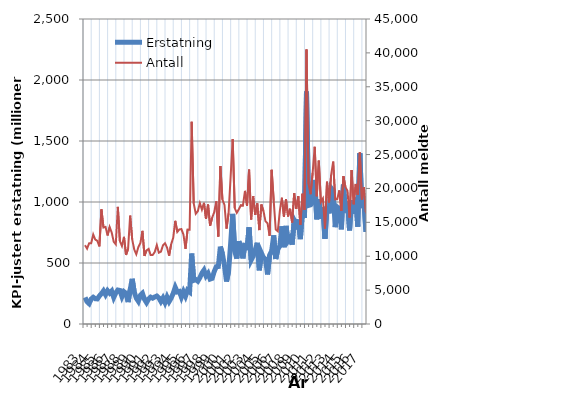
| Category | Erstatning |
|---|---|
| 1983.0 | 217.738 |
| nan | 182.39 |
| nan | 166.795 |
| nan | 204.317 |
| 1984.0 | 219.095 |
| nan | 207.248 |
| nan | 205.483 |
| nan | 229.834 |
| 1985.0 | 248.366 |
| nan | 271.471 |
| nan | 240.555 |
| nan | 272.822 |
| 1986.0 | 252.948 |
| nan | 270.665 |
| nan | 217.848 |
| nan | 254.933 |
| 1987.0 | 278.509 |
| nan | 274.837 |
| nan | 224.911 |
| nan | 264.614 |
| 1988.0 | 251.86 |
| nan | 179.537 |
| nan | 279.633 |
| nan | 370.436 |
| 1989.0 | 261.704 |
| nan | 211.52 |
| nan | 186.12 |
| nan | 234.811 |
| 1990.0 | 251.421 |
| nan | 202.269 |
| nan | 175.421 |
| nan | 204.183 |
| 1991.0 | 220.333 |
| nan | 211.849 |
| nan | 221.715 |
| nan | 229.225 |
| 1992.0 | 214.139 |
| nan | 184.514 |
| nan | 213.2 |
| nan | 175.933 |
| 1993.0 | 220.747 |
| nan | 183.711 |
| nan | 212.245 |
| nan | 251.093 |
| 1994.0 | 300.738 |
| nan | 262.914 |
| nan | 267.117 |
| nan | 220.171 |
| 1995.0 | 265.26 |
| nan | 228.202 |
| nan | 277.29 |
| nan | 263.273 |
| 1996.0 | 577.355 |
| nan | 357.508 |
| nan | 363.895 |
| nan | 350.948 |
| 1997.0 | 379.933 |
| nan | 416.911 |
| nan | 441.514 |
| nan | 393.933 |
| 1998.0 | 415.589 |
| nan | 368.173 |
| nan | 374.188 |
| nan | 430.086 |
| 1999.0 | 469.101 |
| nan | 471.379 |
| nan | 634.301 |
| nan | 574.443 |
| 2000.0 | 478.837 |
| nan | 347.74 |
| nan | 431.1 |
| nan | 657.294 |
| 2001.0 | 902.061 |
| nan | 597.168 |
| nan | 536.336 |
| nan | 678.575 |
| 2002.0 | 618.016 |
| nan | 537.735 |
| nan | 664.547 |
| nan | 605.551 |
| 2003.0 | 791.978 |
| nan | 523.627 |
| nan | 557.072 |
| nan | 606.848 |
| 2004.0 | 665.746 |
| nan | 440.146 |
| nan | 581.891 |
| nan | 543.889 |
| 2005.0 | 532.334 |
| nan | 406.244 |
| nan | 563.978 |
| nan | 597.674 |
| 2006.0 | 726.484 |
| nan | 532.776 |
| nan | 613.024 |
| nan | 639.554 |
| 2007.0 | 800.528 |
| nan | 629.384 |
| nan | 804.144 |
| nan | 679.889 |
| 2008.0 | 703.094 |
| nan | 650.888 |
| nan | 850.097 |
| nan | 816.43 |
| 2009.0 | 856.753 |
| nan | 695.547 |
| nan | 918.799 |
| nan | 868.457 |
| 2010.0 | 1905.043 |
| nan | 971.666 |
| nan | 976.341 |
| nan | 998.838 |
| 2011.0 | 1180.444 |
| nan | 858.391 |
| nan | 1023.5 |
| nan | 862.569 |
| 2012.0 | 955.608 |
| nan | 698.637 |
| nan | 963.225 |
| nan | 906.967 |
| 2013.0 | 1113.851 |
| nan | 1090.67 |
| nan | 793.622 |
| nan | 958.603 |
| 2014.0 | 945.44 |
| nan | 776.393 |
| nan | 1142.115 |
| nan | 913.19 |
| 2015.0 | 1001.888 |
| nan | 767.27 |
| nan | 1015.647 |
| nan | 901.778 |
| 2016.0 | 1036.665 |
| nan | 797.959 |
| nan | 1399.479 |
| nan | 949.547 |
| 2017.0 | 1017.751 |
| nan | 754.949 |